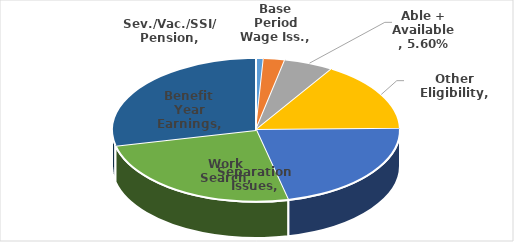
| Category | Series 0 |
|---|---|
| Sev./Vac./SSI/ Pension | 0.009 |
| Base Period Wage Iss. | 0.024 |
| Able + Available | 0.056 |
| Other Eligibility | 0.159 |
| Separation Issues | 0.217 |
| Work Search | 0.251 |
| Benefit Year Earnings | 0.285 |